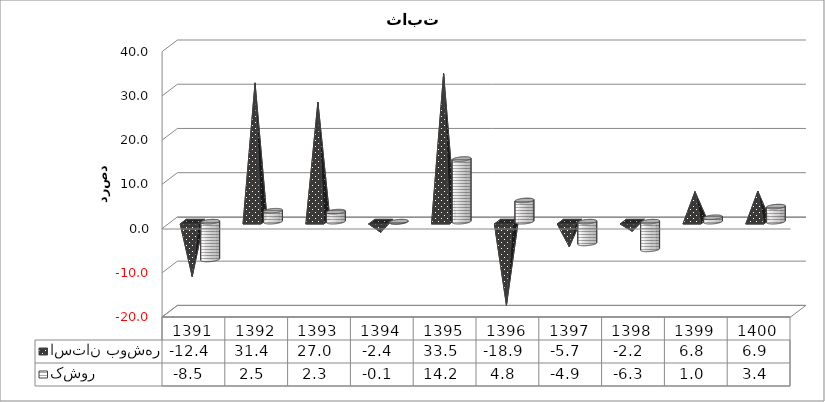
| Category | استان بوشهر | کشور |
|---|---|---|
| 1391.0 | -12.39 | -8.54 |
| 1392.0 | 31.37 | 2.47 |
| 1393.0 | 27.02 | 2.27 |
| 1394.0 | -2.42 | -0.06 |
| 1395.0 | 33.47 | 14.16 |
| 1396.0 | -18.88 | 4.8 |
| 1397.0 | -5.68 | -4.92 |
| 1398.0 | -2.163 | -6.261 |
| 1399.0 | 6.782 | 0.994 |
| 1400.0 | 6.882 | 3.404 |